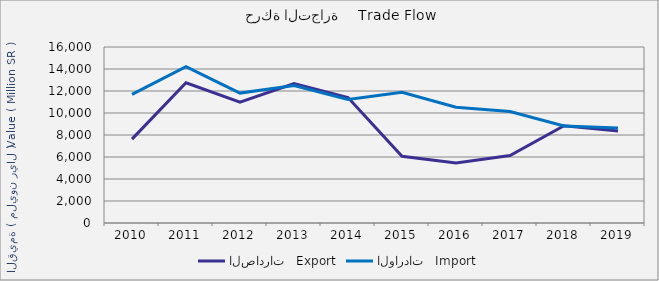
| Category | الصادرات   Export | الواردات   Import |
|---|---|---|
| 2010.0 | 7626588777 | 11699085387 |
| 2011.0 | 12746047891 | 14222156190 |
| 2012.0 | 10987481103 | 11810326920 |
| 2013.0 | 12670243407 | 12499800335 |
| 2014.0 | 11399582551 | 11225087135 |
| 2015.0 | 6068885843 | 11888549918 |
| 2016.0 | 5451970930 | 10518070844 |
| 2017.0 | 6130326195 | 10135435827 |
| 2018.0 | 8839957313 | 8823565845 |
| 2019.0 | 8360791670 | 8641553119 |